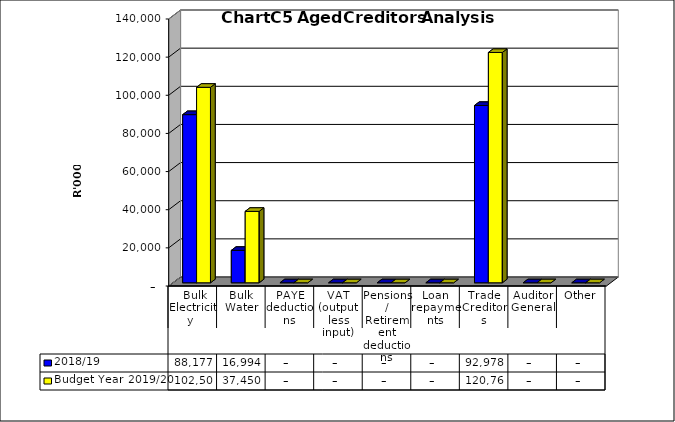
| Category | 2018/19 | Budget Year 2019/20 |
|---|---|---|
|  Bulk Electricity  | 88177456.2 | 102504502.55 |
| Bulk Water | 16993977.55 | 37449822.8 |
| PAYE deductions | 0 | 0 |
| VAT (output less input) | 0 | 0 |
| Pensions / Retirement deductions | 0 | 0 |
| Loan repayments | 0 | 0 |
| Trade Creditors | 92978105 | 120769042.62 |
| Auditor General | 0 | 0 |
| Other | 0 | 0 |